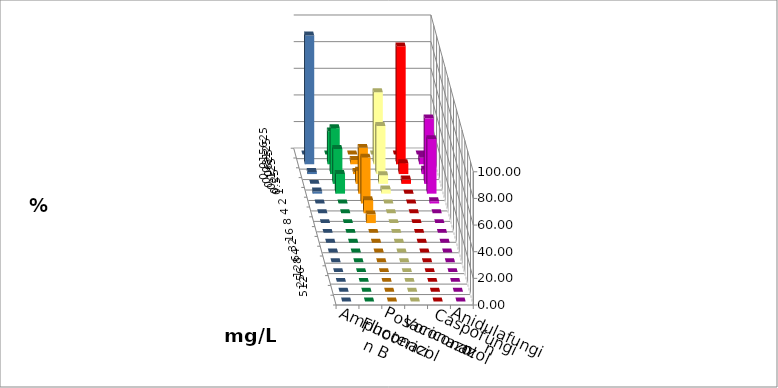
| Category | Amphotericin B | Fluconazol | Posaconazol | Voriconazol | Caspofungin | Anidulafungin |
|---|---|---|---|---|---|---|
| 0.015625 | 0 | 0 | 0 | 0 | 0 | 0 |
| 0.03125 | 24.59 | 3.279 | 54.098 | 88.525 | 4.918 | 96.721 |
| 0.0625 | 34.426 | 1.639 | 36.066 | 8.197 | 3.279 | 1.639 |
| 0.125 | 26.23 | 9.836 | 6.557 | 3.279 | 49.18 | 0 |
| 0.25 | 14.754 | 34.426 | 3.279 | 0 | 40.984 | 1.639 |
| 0.5 | 0 | 34.426 | 0 | 0 | 1.639 | 0 |
| 1.0 | 0 | 9.836 | 0 | 0 | 0 | 0 |
| 2.0 | 0 | 6.557 | 0 | 0 | 0 | 0 |
| 4.0 | 0 | 0 | 0 | 0 | 0 | 0 |
| 8.0 | 0 | 0 | 0 | 0 | 0 | 0 |
| 16.0 | 0 | 0 | 0 | 0 | 0 | 0 |
| 32.0 | 0 | 0 | 0 | 0 | 0 | 0 |
| 64.0 | 0 | 0 | 0 | 0 | 0 | 0 |
| 128.0 | 0 | 0 | 0 | 0 | 0 | 0 |
| 256.0 | 0 | 0 | 0 | 0 | 0 | 0 |
| 512.0 | 0 | 0 | 0 | 0 | 0 | 0 |